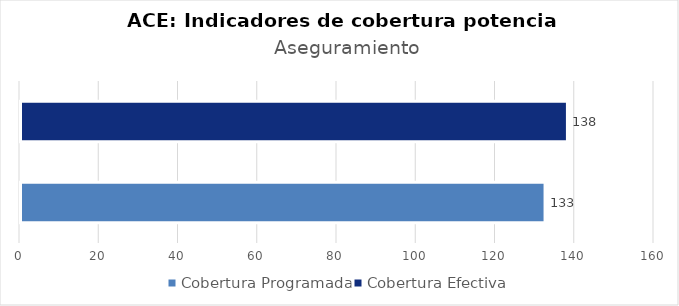
| Category | Aseguramiento |
|---|---|
| Cobertura Programada | 132.505 |
| Cobertura Efectiva | 138.152 |